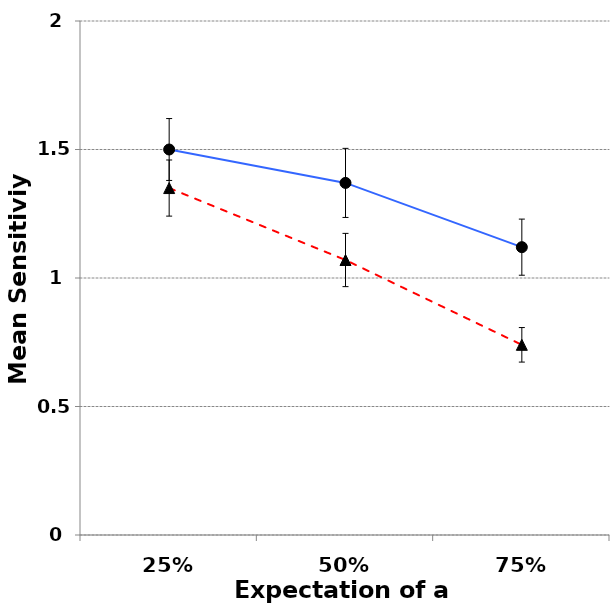
| Category | Series3 | Series4 |
|---|---|---|
| 25% | 1.5 | 1.35 |
| 50% | 1.37 | 1.07 |
| 75% | 1.12 | 0.74 |